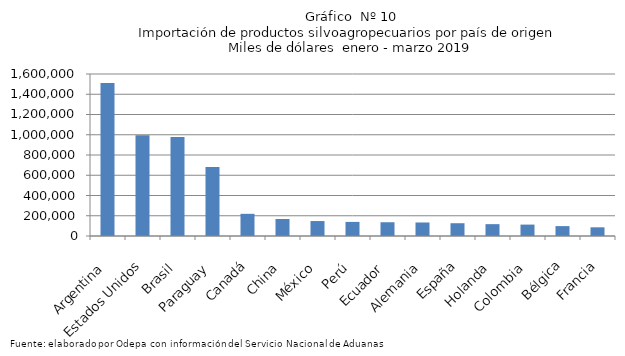
| Category | Series 0 |
|---|---|
| Argentina | 1511898.783 |
| Estados Unidos | 995791.239 |
| Brasil | 977575.404 |
| Paraguay | 681359.21 |
| Canadá | 219022.502 |
| China | 167702.1 |
| México | 147674.438 |
| Perú | 139239.678 |
| Ecuador | 135878.969 |
| Alemania | 133540.858 |
| España | 126262.827 |
| Holanda | 117001.561 |
| Colombia | 112650.483 |
| Bélgica | 97694.409 |
| Francia | 85786.536 |